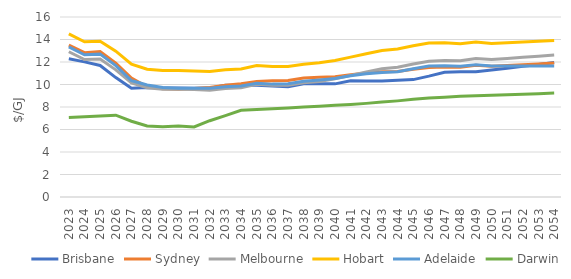
| Category | Brisbane | Sydney | Melbourne | Hobart | Adelaide | Darwin |
|---|---|---|---|---|---|---|
| 2023.0 | 12.281 | 13.508 | 12.913 | 14.495 | 13.338 | 7.075 |
| 2024.0 | 12.01 | 12.833 | 12.219 | 13.801 | 12.644 | 7.14 |
| 2025.0 | 11.691 | 12.922 | 12.26 | 13.843 | 12.7 | 7.206 |
| 2026.0 | 10.614 | 11.909 | 11.302 | 12.964 | 11.678 | 7.272 |
| 2027.0 | 9.661 | 10.563 | 10.148 | 11.81 | 10.35 | 6.734 |
| 2028.0 | 9.729 | 9.793 | 9.701 | 11.363 | 9.963 | 6.312 |
| 2029.0 | 9.679 | 9.624 | 9.573 | 11.234 | 9.734 | 6.251 |
| 2030.0 | 9.687 | 9.57 | 9.581 | 11.243 | 9.66 | 6.319 |
| 2031.0 | 9.668 | 9.641 | 9.547 | 11.208 | 9.662 | 6.222 |
| 2032.0 | 9.679 | 9.744 | 9.499 | 11.161 | 9.667 | 6.781 |
| 2033.0 | 9.937 | 9.928 | 9.642 | 11.304 | 9.797 | 7.228 |
| 2034.0 | 9.937 | 10.074 | 9.719 | 11.381 | 9.869 | 7.702 |
| 2035.0 | 9.929 | 10.261 | 10.028 | 11.689 | 10.101 | 7.774 |
| 2036.0 | 9.875 | 10.325 | 9.928 | 11.589 | 10.033 | 7.848 |
| 2037.0 | 9.806 | 10.363 | 9.944 | 11.605 | 10.059 | 7.922 |
| 2038.0 | 10.056 | 10.571 | 10.147 | 11.809 | 10.29 | 7.996 |
| 2039.0 | 10.056 | 10.654 | 10.263 | 11.925 | 10.405 | 8.072 |
| 2040.0 | 10.056 | 10.687 | 10.516 | 12.138 | 10.535 | 8.148 |
| 2041.0 | 10.322 | 10.871 | 10.81 | 12.433 | 10.783 | 8.225 |
| 2042.0 | 10.306 | 11.013 | 11.117 | 12.739 | 10.946 | 8.322 |
| 2043.0 | 10.306 | 11.123 | 11.397 | 13.019 | 11.065 | 8.437 |
| 2044.0 | 10.367 | 11.153 | 11.529 | 13.151 | 11.129 | 8.545 |
| 2045.0 | 10.434 | 11.365 | 11.821 | 13.443 | 11.406 | 8.678 |
| 2046.0 | 10.742 | 11.521 | 12.075 | 13.697 | 11.637 | 8.8 |
| 2047.0 | 11.092 | 11.548 | 12.132 | 13.704 | 11.677 | 8.876 |
| 2048.0 | 11.13 | 11.524 | 12.109 | 13.633 | 11.629 | 8.945 |
| 2049.0 | 11.132 | 11.716 | 12.3 | 13.777 | 11.755 | 9.006 |
| 2050.0 | 11.292 | 11.615 | 12.217 | 13.643 | 11.653 | 9.051 |
| 2051.0 | 11.454 | 11.686 | 12.315 | 13.71 | 11.653 | 9.096 |
| 2052.0 | 11.618 | 11.757 | 12.413 | 13.777 | 11.653 | 9.142 |
| 2053.0 | 11.785 | 11.829 | 12.512 | 13.845 | 11.653 | 9.188 |
| 2054.0 | 11.954 | 11.901 | 12.612 | 13.913 | 11.653 | 9.234 |